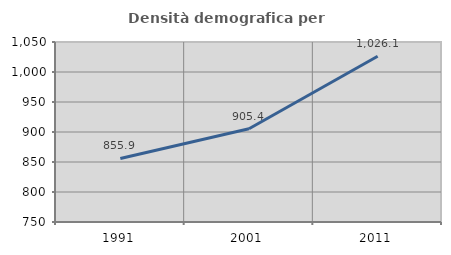
| Category | Densità demografica |
|---|---|
| 1991.0 | 855.908 |
| 2001.0 | 905.45 |
| 2011.0 | 1026.141 |